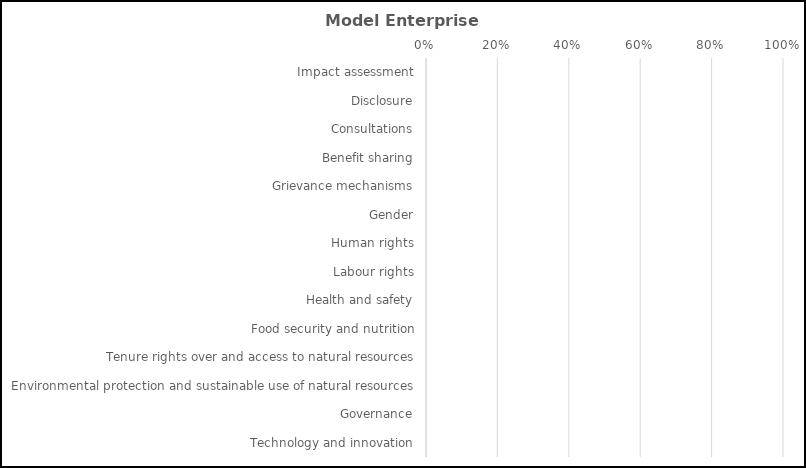
| Category | Red | Yellow | Green |
|---|---|---|---|
| Impact assessment | 0 | 0 | 0 |
| Disclosure | 0 | 0 | 0 |
| Consultations | 0 | 0 | 0 |
| Benefit sharing | 0 | 0 | 0 |
| Grievance mechanisms | 0 | 0 | 0 |
| Gender | 0 | 0 | 0 |
| Human rights | 0 | 0 | 0 |
| Labour rights | 0 | 0 | 0 |
| Health and safety | 0 | 0 | 0 |
| Food security and nutrition | 0 | 0 | 0 |
| Tenure rights over and access to natural resources | 0 | 0 | 0 |
| Environmental protection and sustainable use of natural resources | 0 | 0 | 0 |
| Governance | 0 | 0 | 0 |
| Technology and innovation | 0 | 0 | 0 |